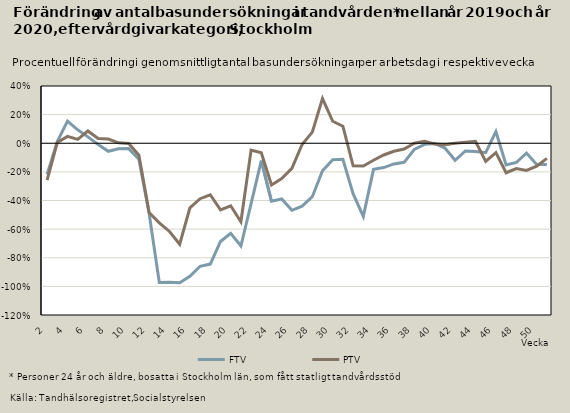
| Category | FTV | PTV |
|---|---|---|
| 2.0 | -0.218 | -0.257 |
| 3.0 | 0.012 | 0.006 |
| 4.0 | 0.154 | 0.048 |
| 5.0 | 0.094 | 0.027 |
| 6.0 | 0.044 | 0.086 |
| 7.0 | -0.008 | 0.033 |
| 8.0 | -0.056 | 0.029 |
| 9.0 | -0.038 | 0.003 |
| 10.0 | -0.037 | -0.001 |
| 11.0 | -0.112 | -0.084 |
| 12.0 | -0.489 | -0.483 |
| 13.0 | -0.972 | -0.556 |
| 14.0 | -0.971 | -0.616 |
| 15.0 | -0.975 | -0.706 |
| 16.0 | -0.929 | -0.452 |
| 17.0 | -0.86 | -0.387 |
| 18.0 | -0.844 | -0.36 |
| 19.0 | -0.686 | -0.465 |
| 20.0 | -0.63 | -0.437 |
| 21.0 | -0.718 | -0.549 |
| 22.0 | -0.422 | -0.048 |
| 23.0 | -0.121 | -0.066 |
| 24.0 | -0.406 | -0.292 |
| 25.0 | -0.39 | -0.247 |
| 26.0 | -0.468 | -0.176 |
| 27.0 | -0.439 | -0.009 |
| 28.0 | -0.373 | 0.078 |
| 29.0 | -0.192 | 0.312 |
| 30.0 | -0.115 | 0.154 |
| 31.0 | -0.112 | 0.119 |
| 32.0 | -0.352 | -0.158 |
| 33.0 | -0.511 | -0.159 |
| 34.0 | -0.182 | -0.119 |
| 35.0 | -0.17 | -0.082 |
| 36.0 | -0.144 | -0.056 |
| 37.0 | -0.133 | -0.04 |
| 38.0 | -0.043 | 0 |
| 39.0 | -0.008 | 0.014 |
| 40.0 | -0.001 | -0.006 |
| 41.0 | -0.033 | -0.01 |
| 42.0 | -0.119 | 0 |
| 43.0 | -0.054 | 0.006 |
| 44.0 | -0.058 | 0.013 |
| 45.0 | -0.066 | -0.126 |
| 46.0 | 0.082 | -0.065 |
| 47.0 | -0.151 | -0.206 |
| 48.0 | -0.134 | -0.177 |
| 49.0 | -0.069 | -0.19 |
| 50.0 | -0.148 | -0.161 |
| 51.0 | -0.148 | -0.106 |